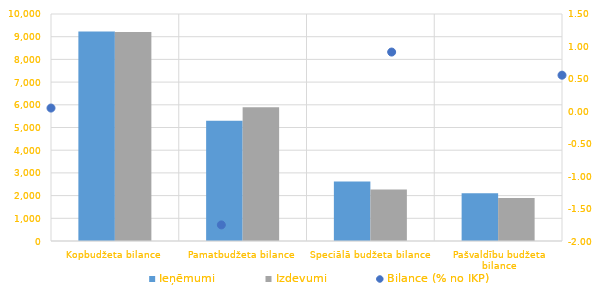
| Category | Ieņēmumi | Izdevumi |
|---|---|---|
| Kopbudžeta bilance | 9224425.681 | 9205300.726 |
| Pamatbudžeta bilance | 5292404.031 | 5888455.045 |
| Speciālā budžeta bilance | 2619349.978 | 2268971.558 |
| Pašvaldību budžeta bilance | 2106869.654 | 1893310.98 |